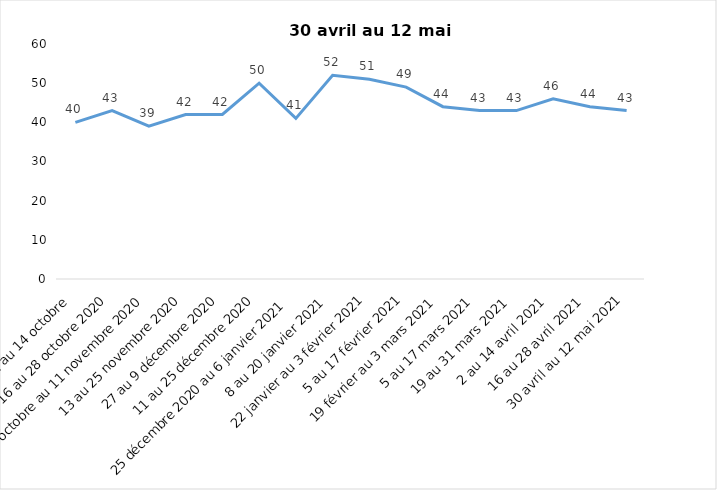
| Category | Toujours aux trois mesures |
|---|---|
| 2 au 14 octobre  | 40 |
| 16 au 28 octobre 2020 | 43 |
| 30 octobre au 11 novembre 2020 | 39 |
| 13 au 25 novembre 2020 | 42 |
| 27 au 9 décembre 2020 | 42 |
| 11 au 25 décembre 2020 | 50 |
| 25 décembre 2020 au 6 janvier 2021 | 41 |
| 8 au 20 janvier 2021 | 52 |
| 22 janvier au 3 février 2021 | 51 |
| 5 au 17 février 2021 | 49 |
| 19 février au 3 mars 2021 | 44 |
| 5 au 17 mars 2021 | 43 |
| 19 au 31 mars 2021 | 43 |
| 2 au 14 avril 2021 | 46 |
| 16 au 28 avril 2021 | 44 |
| 30 avril au 12 mai 2021 | 43 |